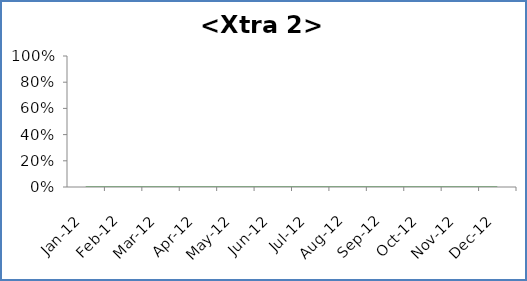
| Category | <Xtra 3> | Median | Goal |
|---|---|---|---|
| 2012-01-01 |  | 0 | 0 |
| 2012-02-01 |  | 0 | 0 |
| 2012-03-01 |  | 0 | 0 |
| 2012-04-01 |  | 0 | 0 |
| 2012-05-01 |  | 0 | 0 |
| 2012-06-01 |  | 0 | 0 |
| 2012-07-01 |  | 0 | 0 |
| 2012-08-01 |  | 0 | 0 |
| 2012-09-01 |  | 0 | 0 |
| 2012-10-01 |  | 0 | 0 |
| 2012-11-01 |  | 0 | 0 |
| 2012-12-01 |  | 0 | 0 |